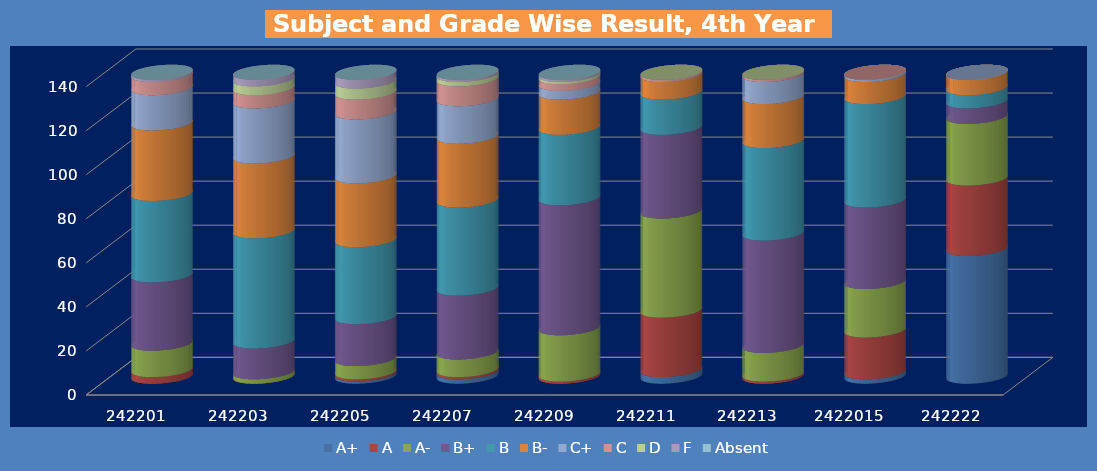
| Category | A+ | A | A- | B+ | B | B- | C+ | C | D | F | Absent |
|---|---|---|---|---|---|---|---|---|---|---|---|
| 242201.0 | 0 | 3 | 12 | 31 | 37 | 32 | 16 | 6 | 0 | 1 | 0 |
| 242203.0 | 0 | 0 | 2 | 14 | 50 | 34 | 25 | 6 | 4 | 3 | 0 |
| 242205.0 | 1 | 1 | 6 | 19 | 35 | 29 | 29 | 9 | 5 | 4 | 0 |
| 242207.0 | 2 | 1 | 8 | 29 | 40 | 29 | 17 | 9 | 2 | 1 | 0 |
| 242209.0 | 0 | 1 | 21 | 59 | 32 | 16 | 4 | 3 | 1 | 1 | 0 |
| 242211.0 | 3 | 27 | 45 | 38 | 16 | 8 | 0 | 1 | 0 | 0 | 0 |
| 242213.0 | 0 | 1 | 13 | 51 | 42 | 20 | 10 | 1 | 0 | 0 | 0 |
| 2422015.0 | 2 | 19 | 22 | 37 | 47 | 10 | 1 | 0 | 0 | 0 | 0 |
| 242222.0 | 58 | 32 | 28 | 7 | 6 | 7 | 0 | 0 | 0 | 0 | 0 |